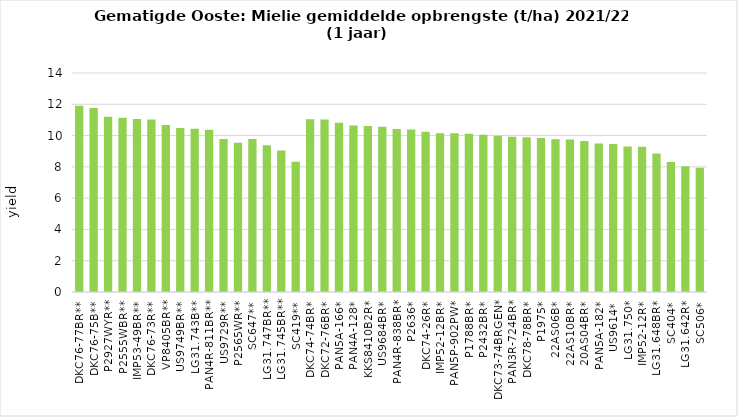
| Category | Series 0 |
|---|---|
| DKC76-77BR** | 11.9 |
| DKC76-75B** | 11.77 |
| P2927WYR** | 11.21 |
| P2555WBR** | 11.142 |
| IMP53-49BR** | 11.057 |
| DKC76-73R** | 11.03 |
| VP8405BR** | 10.682 |
| US9749BR** | 10.485 |
| LG31.743B** | 10.43 |
| PAN4R-811BR** | 10.38 |
| US9729R** | 9.775 |
| P2565WR** | 9.537 |
| SC647** | 9.778 |
| LG31.747BR** | 9.378 |
| LG31.745BR** | 9.05 |
| SC419** | 8.332 |
| DKC74-74BR* | 11.048 |
| DKC72-76BR* | 11.032 |
| PAN5A-166* | 10.813 |
| PAN4A-128* | 10.643 |
| KKS8410B2R* | 10.605 |
| US9684BR* | 10.568 |
| PAN4R-838BR* | 10.422 |
| P2636* | 10.388 |
| DKC74-26R* | 10.247 |
| IMP52-12BR* | 10.152 |
| PAN5P-902PW* | 10.148 |
| P1788BR* | 10.11 |
| P2432BR* | 10.047 |
| DKC73-74BRGEN* | 9.992 |
| PAN3R-724BR* | 9.93 |
| DKC78-78BR* | 9.888 |
| P1975* | 9.85 |
| 22AS06B* | 9.765 |
| 22AS10BR* | 9.757 |
| 20AS04BR* | 9.653 |
| PAN5A-182* | 9.497 |
| US9614* | 9.453 |
| LG31.750* | 9.295 |
| IMP52-12R* | 9.283 |
| LG31.648BR* | 8.853 |
| SC404* | 8.307 |
| LG31.642R* | 8.038 |
| SC506* | 7.942 |